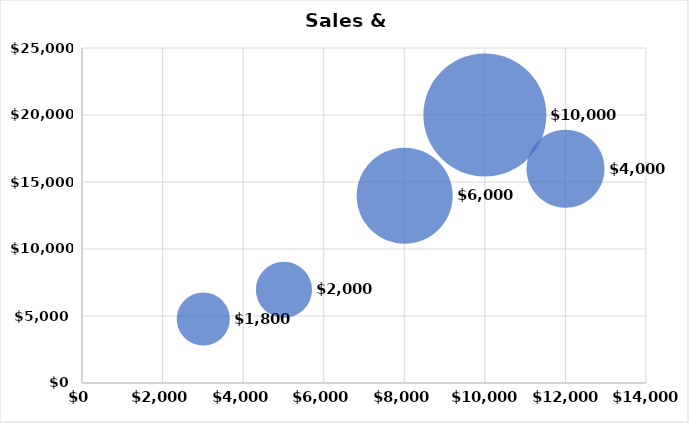
| Category | Series 0 |
|---|---|
| 10000.0 | 20000 |
| 12000.0 | 16000 |
| 8000.0 | 14000 |
| 5000.0 | 7000 |
| 3000.0 | 4800 |